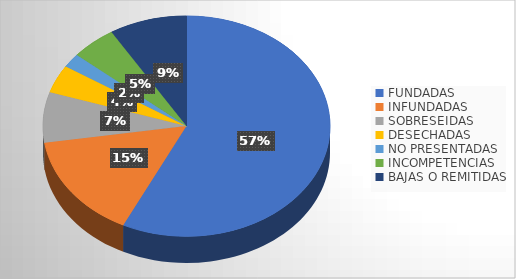
| Category | Series 0 |
|---|---|
| FUNDADAS | 695 |
| INFUNDADAS | 186 |
| SOBRESEIDAS | 90 |
| DESECHADAS | 50 |
| NO PRESENTADAS | 25 |
| INCOMPETENCIAS | 62 |
| BAJAS O REMITIDAS | 106 |